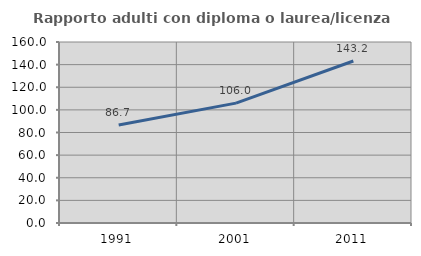
| Category | Rapporto adulti con diploma o laurea/licenza media  |
|---|---|
| 1991.0 | 86.667 |
| 2001.0 | 105.983 |
| 2011.0 | 143.2 |